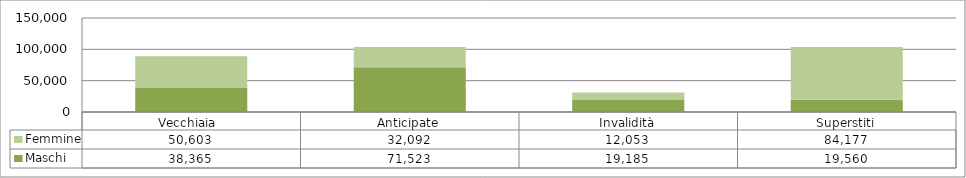
| Category | Maschi | Femmine |
|---|---|---|
| Vecchiaia  | 38365 | 50603 |
| Anticipate | 71523 | 32092 |
| Invalidità | 19185 | 12053 |
| Superstiti | 19560 | 84177 |